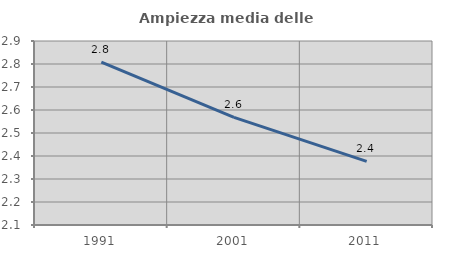
| Category | Ampiezza media delle famiglie |
|---|---|
| 1991.0 | 2.808 |
| 2001.0 | 2.568 |
| 2011.0 | 2.377 |